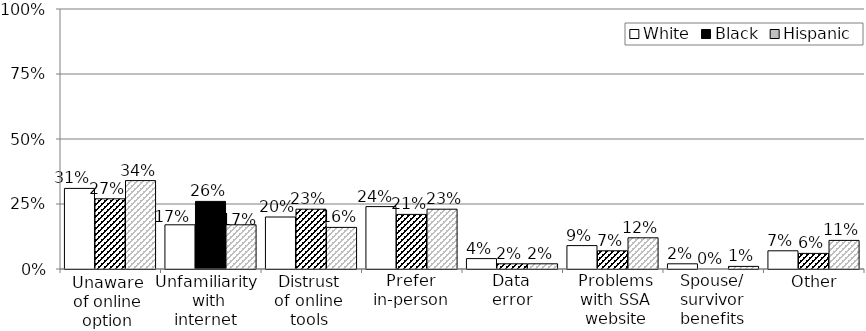
| Category | White | Black | Hispanic |
|---|---|---|---|
| Unaware of online option | 0.31 | 0.27 | 0.34 |
| Unfamiliarity with internet | 0.17 | 0.26 | 0.17 |
| Distrust of online tools | 0.2 | 0.23 | 0.16 |
| Prefer in-person | 0.24 | 0.21 | 0.23 |
| Data error | 0.04 | 0.02 | 0.02 |
| Problems with SSA website | 0.09 | 0.07 | 0.12 |
| Spouse/survivor benefits | 0.02 | 0 | 0.01 |
| Other | 0.07 | 0.06 | 0.11 |